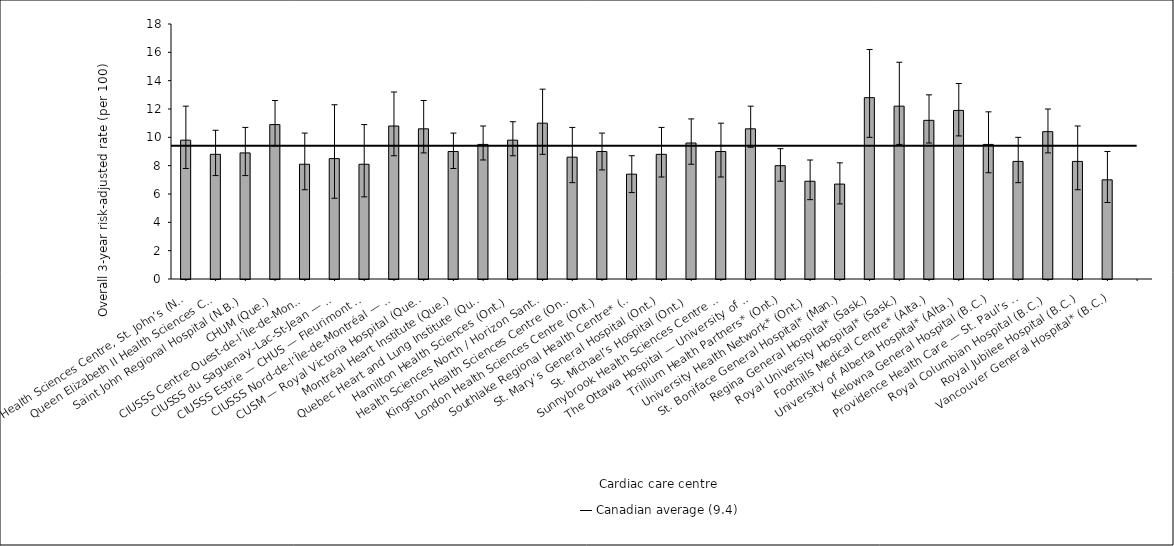
| Category | Risk-adjusted rate |
|---|---|
| Health Sciences Centre, St. John’s (N.L.) | 9.8 |
| Queen Elizabeth II Health Sciences Centre (N.S.) | 8.8 |
| Saint John Regional Hospital (N.B.) | 8.9 |
| CHUM (Que.) | 10.9 |
| CIUSSS Centre-Ouest-de-l’Île-de-Montréal — Jewish General Hospital (Que.) | 8.1 |
| CIUSSS du Saguenay–Lac-St-Jean — Chicoutimi Hospital (Que.) | 8.5 |
| CIUSSS Estrie — CHUS — Fleurimont Hospital (Que.) | 8.1 |
| CIUSSS Nord-de-l’Île-de-Montréal — Montréal Sacré-Coeur Hospital (Que.) | 10.8 |
| CUSM — Royal Victoria Hospital (Que.) | 10.6 |
| Montréal Heart Institute (Que.) | 9 |
| Quebec Heart and Lung Institute (Que.) | 9.5 |
| Hamilton Health Sciences (Ont.) | 9.8 |
| Health Sciences North / Horizon Santé-Nord (Ont.) | 11 |
| Kingston Health Sciences Centre (Ont.) | 8.6 |
| London Health Sciences Centre (Ont.) | 9 |
| Southlake Regional Health Centre* (Ont.) | 7.4 |
| St. Mary’s General Hospital (Ont.) | 8.8 |
| St. Michael’s Hospital (Ont.) | 9.6 |
| Sunnybrook Health Sciences Centre (Ont.) | 9 |
| The Ottawa Hospital — University of Ottawa Heart Institute (Ont.) | 10.6 |
| Trillium Health Partners* (Ont.) | 8 |
| University Health Network* (Ont.) | 6.9 |
| St. Boniface General Hospital* (Man.) | 6.7 |
| Regina General Hospital* (Sask.) | 12.8 |
| Royal University Hospital* (Sask.) | 12.2 |
| Foothills Medical Centre* (Alta.) | 11.2 |
| University of Alberta Hospital* (Alta.) | 11.9 |
| Kelowna General Hospital (B.C.) | 9.5 |
| Providence Health Care — St. Paul’s Hospital (Vancouver) (B.C.) | 8.3 |
| Royal Columbian Hospital (B.C.) | 10.4 |
| Royal Jubilee Hospital (B.C.) | 8.3 |
| Vancouver General Hospital* (B.C.) | 7 |